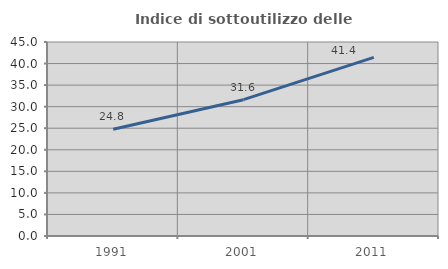
| Category | Indice di sottoutilizzo delle abitazioni  |
|---|---|
| 1991.0 | 24.771 |
| 2001.0 | 31.624 |
| 2011.0 | 41.423 |